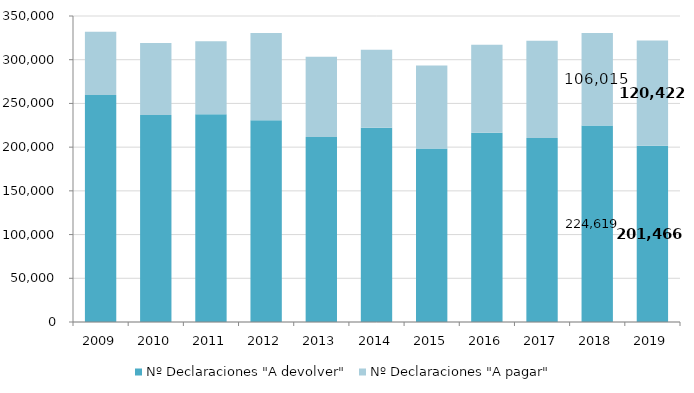
| Category | Nº Declaraciones "A devolver" | Nº Declaraciones "A pagar" |
|---|---|---|
| 2009.0 | 259702 | 72208 |
| 2010.0 | 236808 | 82185 |
| 2011.0 | 237625 | 83528 |
| 2012.0 | 230745 | 99745 |
| 2013.0 | 211586 | 91870 |
| 2014.0 | 222131 | 89308 |
| 2015.0 | 198331 | 94958 |
| 2016.0 | 216509 | 100568 |
| 2017.0 | 210528 | 111261 |
| 2018.0 | 224619.366 | 106015.04 |
| 2019.0 | 201466 | 120422 |